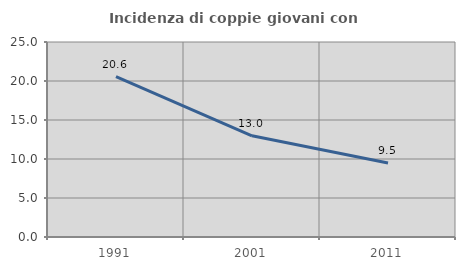
| Category | Incidenza di coppie giovani con figli |
|---|---|
| 1991.0 | 20.558 |
| 2001.0 | 12.976 |
| 2011.0 | 9.483 |